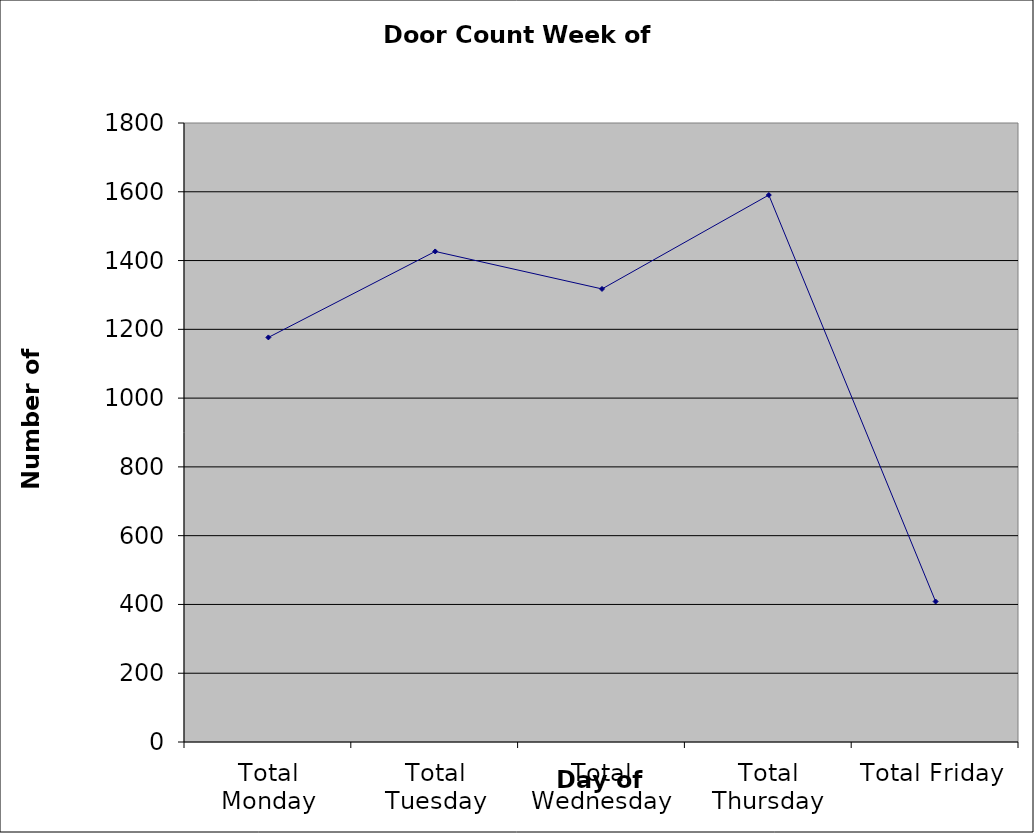
| Category | Series 0 |
|---|---|
| Total Monday | 1176.5 |
| Total Tuesday | 1426.5 |
| Total Wednesday | 1317.5 |
| Total Thursday | 1590.5 |
| Total Friday | 408.5 |